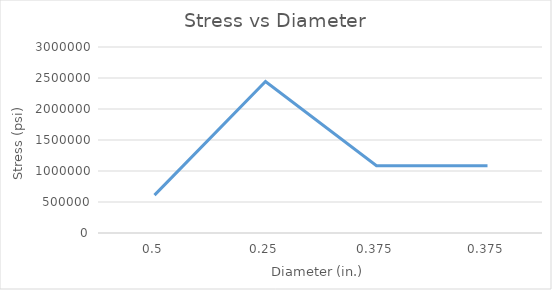
| Category | Stress vs Diameter |
|---|---|
| 0.5 | 611154.982 |
| 0.25 | 2444619.929 |
| 0.375 | 1086497.746 |
| 0.375 | 1086497.746 |